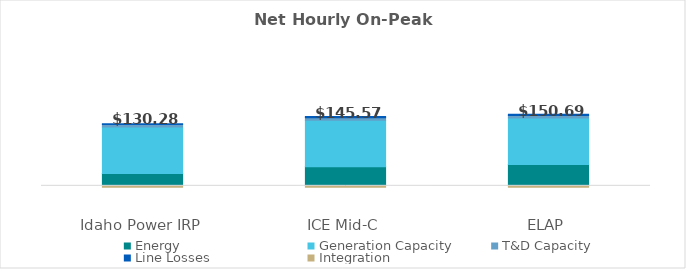
| Category | Energy | Generation Capacity | T&D Capacity | Line Losses | Integration |
|---|---|---|---|---|---|
| 0 | 26.332 | 99.9 | 5.452 | 1.527 | -2.93 |
| 1 | 40.779 | 99.9 | 5.452 | 2.365 | -2.93 |
| 2 | 45.622 | 99.9 | 5.452 | 2.646 | -2.93 |